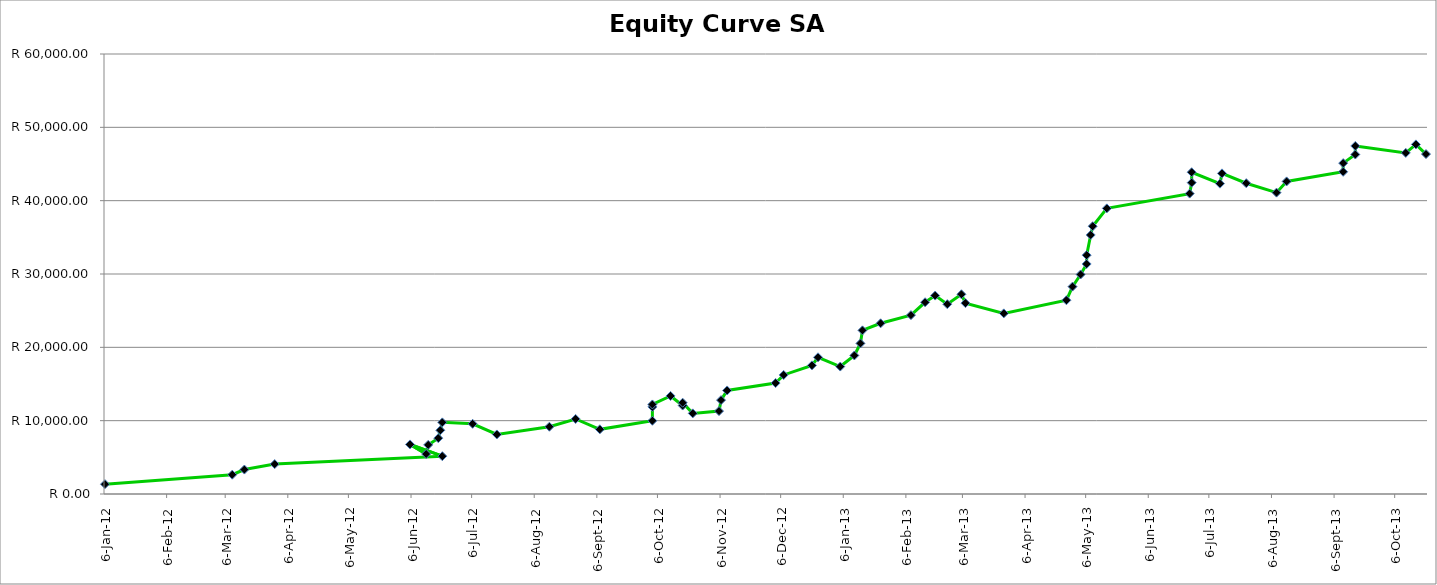
| Category | Date |
|---|---|
| 2012-01-06 | 1333.856 |
| 2012-03-09 | 2631.344 |
| 2012-03-15 | 3331.71 |
| 2012-03-30 | 4079.623 |
| 2012-06-21 | 5157.342 |
| 2012-06-05 | 6756.545 |
| 2012-06-13 | 5453.824 |
| 2012-06-14 | 6697.568 |
| 2012-06-19 | 7614.071 |
| 2012-06-20 | 8689.763 |
| 2012-06-21 | 9767.483 |
| 2012-07-06 | 9569.839 |
| 2012-07-18 | 8119.829 |
| 2012-08-13 | 9174.232 |
| 2012-08-26 | 10231.695 |
| 2012-09-07 | 8815.953 |
| 2012-10-03 | 9985.564 |
| 2012-10-03 | 11879.307 |
| 2012-10-03 | 12213.03 |
| 2012-10-12 | 13370.166 |
| 2012-10-18 | 12061.57 |
| 2012-10-18 | 12450.555 |
| 2012-10-23 | 10994.776 |
| 2012-11-05 | 11308.517 |
| 2012-11-06 | 12801.613 |
| 2012-11-09 | 14118.042 |
| 2012-12-03 | 15131.575 |
| 2012-12-07 | 16235.1 |
| 2012-12-21 | 17541.002 |
| 2012-12-24 | 18640.01 |
| 2013-01-04 | 17379.497 |
| 2013-01-11 | 18896.765 |
| 2013-01-14 | 20534.169 |
| 2013-01-15 | 22317.002 |
| 2013-01-24 | 23276.973 |
| 2013-02-08 | 24390.347 |
| 2013-02-15 | 26144.011 |
| 2013-02-20 | 27057.36 |
| 2013-02-26 | 25885.626 |
| 2013-03-05 | 27234.914 |
| 2013-03-07 | 26026.8 |
| 2013-03-26 | 24632.317 |
| 2013-04-26 | 26424.835 |
| 2013-04-29 | 28279.029 |
| 2013-05-03 | 29935.397 |
| 2013-05-06 | 31363.782 |
| 2013-05-06 | 32573.579 |
| 2013-05-08 | 35322.308 |
| 2013-05-09 | 36514.184 |
| 2013-05-16 | 38946.857 |
| 2013-06-26 | 40963.275 |
| 2013-06-27 | 42453.549 |
| 2013-06-27 | 43876.652 |
| 2013-07-11 | 42321.348 |
| 2013-07-12 | 43721.415 |
| 2013-07-24 | 42378.275 |
| 2013-08-08 | 41095.144 |
| 2013-08-13 | 42626.776 |
| 2013-09-10 | 43934.195 |
| 2013-09-10 | 45116.148 |
| 2013-09-16 | 46294.866 |
| 2013-09-16 | 47459.77 |
| 2013-10-11 | 46516.038 |
| 2013-10-16 | 47673.327 |
| 2013-10-21 | 46356.555 |